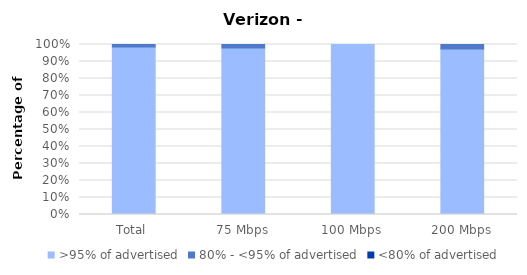
| Category | >95% of advertised | 80% - <95% of advertised | <80% of advertised |
|---|---|---|---|
| Total | 0.985 | 0.015 | 0 |
| 75 Mbps | 0.979 | 0.021 | 0 |
| 100 Mbps | 1 | 0 | 0 |
| 200 Mbps | 0.974 | 0.026 | 0 |